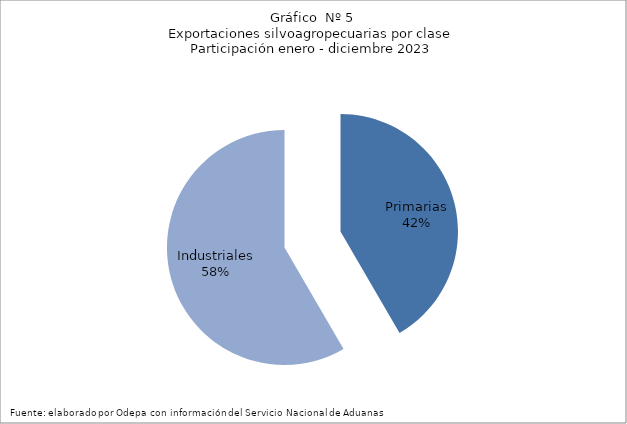
| Category | Series 0 |
|---|---|
| Primarias | 7280467 |
| Industriales | 10212315 |